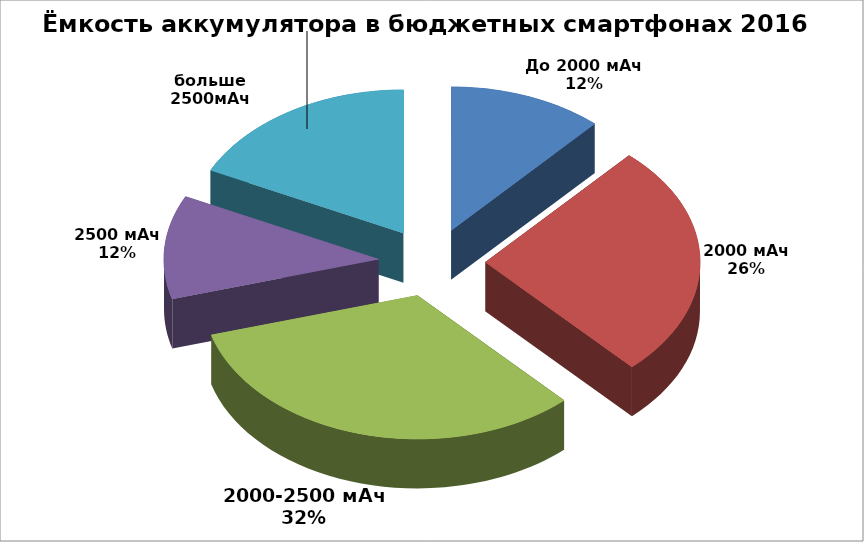
| Category | Series 0 |
|---|---|
| До 2000 мАч | 19 |
| 2000 мАч | 43 |
| 2000-2500 мАч | 53 |
| 2500 мАч | 19 |
| больше 2500мАч | 29 |